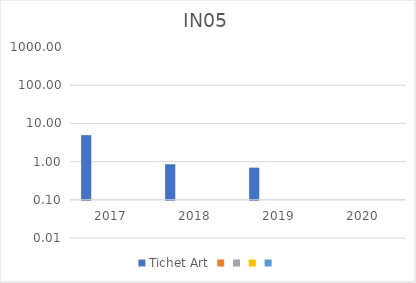
| Category | Tichet Art | Series 1 | Series 2 | Series 3 | Series 4 |
|---|---|---|---|---|---|
| 2017.0 | 4.925 |  |  |  |  |
| 2018.0 | 0.854 |  |  |  |  |
| 2019.0 | 0.695 |  |  |  |  |
| 2020.0 | -3.069 |  |  |  |  |